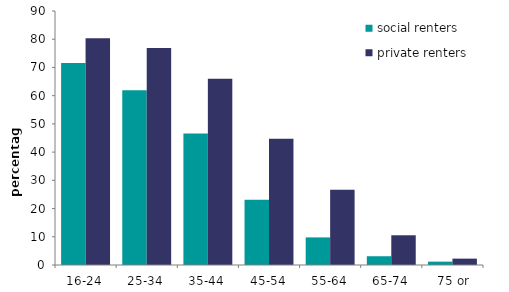
| Category | social renters | private renters |
|---|---|---|
| 16-24 | 71.598 | 80.351 |
| 25-34 | 61.9 | 76.866 |
| 35-44 | 46.629 | 65.98 |
| 45-54 | 23.08 | 44.703 |
| 55-64 | 9.779 | 26.666 |
| 65-74 | 3.106 | 10.533 |
| 75 or over | 1.194 | 2.259 |